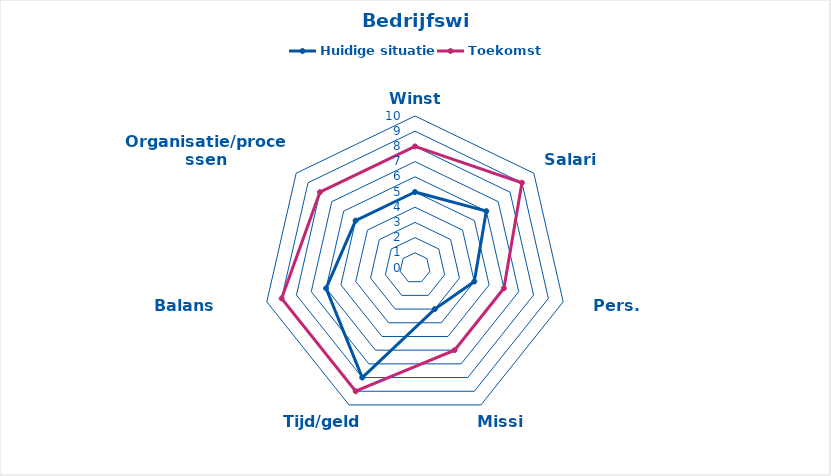
| Category | Huidige situatie | Toekomst |
|---|---|---|
| Winst | 5 | 8 |
| Salaris | 6 | 9 |
| Pers. Ontw | 4 | 6 |
| Missie | 3 | 6 |
| Tijd/geld  | 8 | 9 |
| Balans werk/privé | 6 | 9 |
| Organisatie/processen | 5 | 8 |